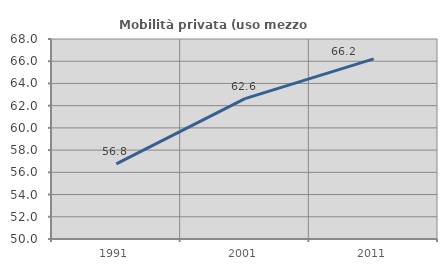
| Category | Mobilità privata (uso mezzo privato) |
|---|---|
| 1991.0 | 56.756 |
| 2001.0 | 62.635 |
| 2011.0 | 66.21 |